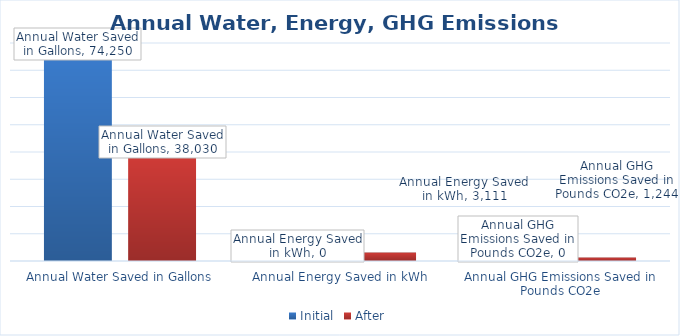
| Category | Initial | After |
|---|---|---|
| Annual Water Saved in Gallons | 74250 | 38030 |
| Annual Energy Saved in kWh | 0 | 3111.29 |
| Annual GHG Emissions Saved in Pounds CO2e | 0 | 1244.15 |